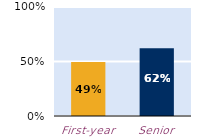
| Category | frequently |
|---|---|
| First-year | 0.494 |
| Senior | 0.621 |